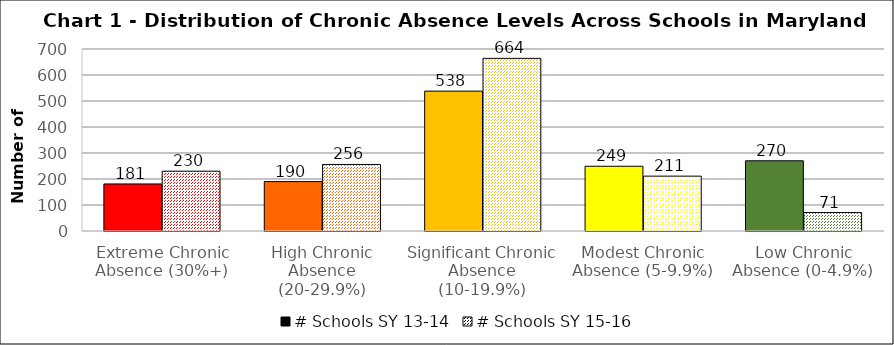
| Category | # Schools SY 13-14 | # Schools SY 15-16 |
|---|---|---|
| Extreme Chronic Absence (30%+) | 181 | 230 |
| High Chronic Absence (20-29.9%) | 190 | 256 |
| Significant Chronic Absence (10-19.9%) | 538 | 664 |
| Modest Chronic Absence (5-9.9%) | 249 | 211 |
| Low Chronic Absence (0-4.9%) | 270 | 71 |